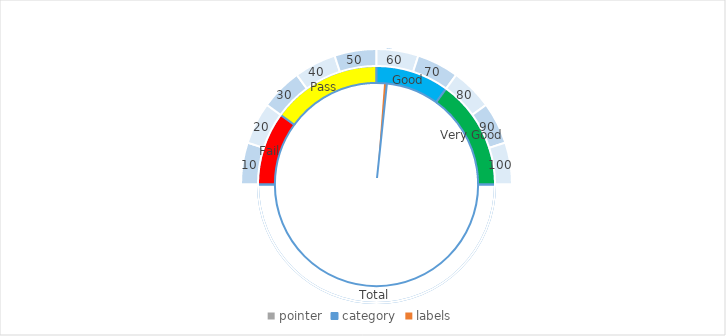
| Category | pointer |
|---|---|
| 0 | 55 |
| 1 | 1 |
| 2 | 154 |